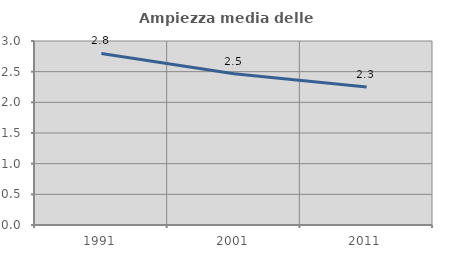
| Category | Ampiezza media delle famiglie |
|---|---|
| 1991.0 | 2.797 |
| 2001.0 | 2.468 |
| 2011.0 | 2.252 |